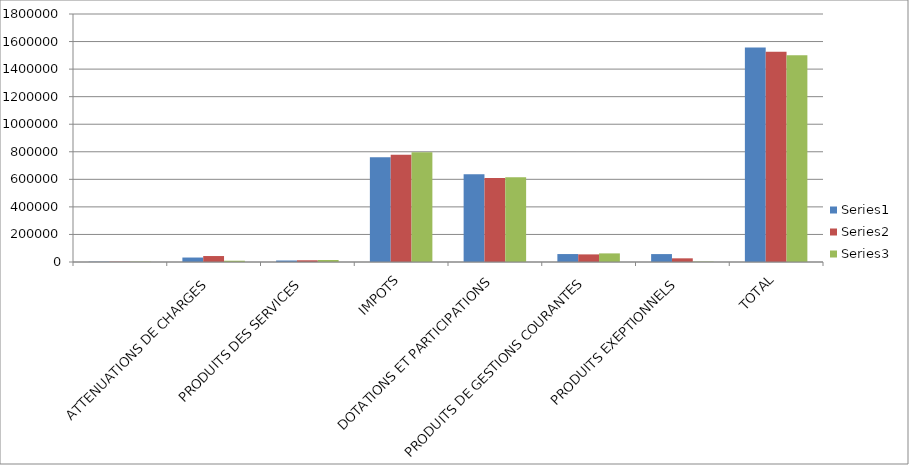
| Category | Series 0 | Series 1 | Series 2 |
|---|---|---|---|
|  | 2014 | 2015 | 2016 |
| ATTENUATIONS DE CHARGES | 32402 | 43284 | 9298 |
| PRODUITS DES SERVICES | 10881 | 12486 | 14529 |
| IMPOTS | 760994 | 778859 | 795830 |
| DOTATIONS ET PARTICIPATIONS | 637039 | 610283 | 616013 |
| PRODUITS DE GESTIONS COURANTES | 57669 | 55229 | 62493 |
| PRODUITS EXEPTIONNELS | 57443 | 26642 | 2453 |
| TOTAL | 1556428 | 1526785 | 1500619 |